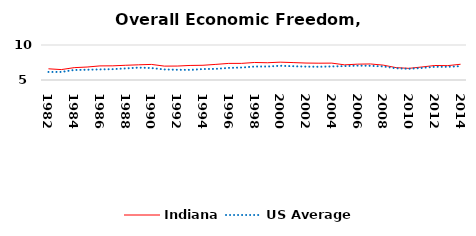
| Category | Indiana | US Average |
|---|---|---|
| 1982.0 | 6.6 | 6.149 |
| 1983.0 | 6.488 | 6.152 |
| 1984.0 | 6.765 | 6.429 |
| 1985.0 | 6.854 | 6.464 |
| 1986.0 | 7.014 | 6.512 |
| 1987.0 | 7.024 | 6.552 |
| 1988.0 | 7.104 | 6.659 |
| 1989.0 | 7.171 | 6.767 |
| 1990.0 | 7.226 | 6.71 |
| 1991.0 | 6.982 | 6.502 |
| 1992.0 | 6.992 | 6.463 |
| 1993.0 | 7.079 | 6.446 |
| 1994.0 | 7.103 | 6.563 |
| 1995.0 | 7.231 | 6.593 |
| 1996.0 | 7.372 | 6.73 |
| 1997.0 | 7.373 | 6.781 |
| 1998.0 | 7.504 | 6.926 |
| 1999.0 | 7.465 | 6.925 |
| 2000.0 | 7.548 | 7.031 |
| 2001.0 | 7.487 | 6.969 |
| 2002.0 | 7.42 | 6.912 |
| 2003.0 | 7.4 | 6.892 |
| 2004.0 | 7.413 | 6.934 |
| 2005.0 | 7.165 | 6.99 |
| 2006.0 | 7.263 | 7.048 |
| 2007.0 | 7.291 | 7.028 |
| 2008.0 | 7.125 | 6.935 |
| 2009.0 | 6.765 | 6.668 |
| 2010.0 | 6.666 | 6.605 |
| 2011.0 | 6.86 | 6.72 |
| 2012.0 | 7.072 | 6.883 |
| 2013.0 | 7.053 | 6.881 |
| 2014.0 | 7.249 | 6.973 |